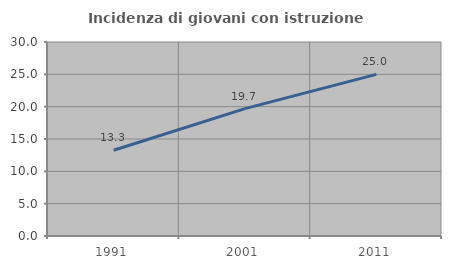
| Category | Incidenza di giovani con istruzione universitaria |
|---|---|
| 1991.0 | 13.253 |
| 2001.0 | 19.697 |
| 2011.0 | 25 |